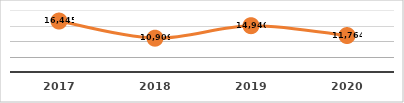
| Category | PERSONAS CAPACITADAS
PRIMER TRIMESTRE, EJERCICIO 2020 |
|---|---|
| 2017.0 | 16445 |
| 2018.0 | 10909 |
| 2019.0 | 14940 |
| 2020.0 | 11764 |